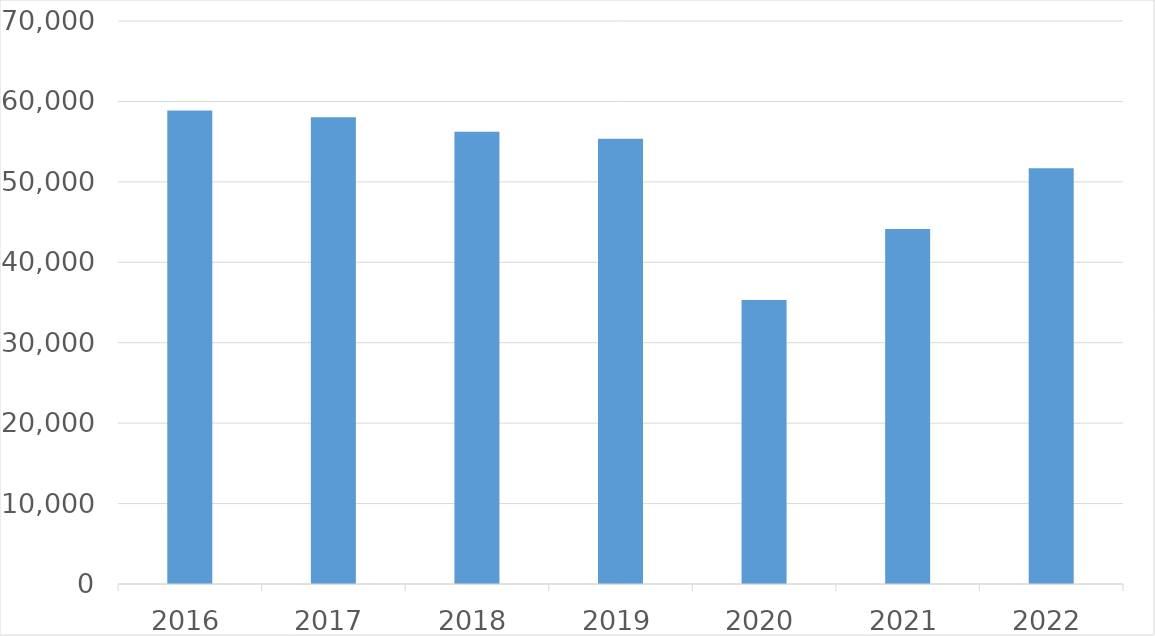
| Category | Series 0 |
|---|---|
| 2016 | 58861 |
| 2017 | 58025 |
| 2018 | 56231 |
| 2019 | 55353 |
| 2020 | 35315 |
| 2021 | 44124 |
| 2022 | 51678 |